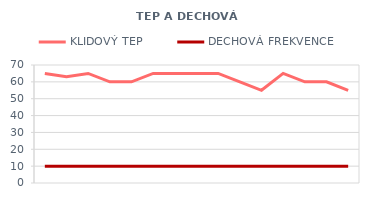
| Category | KLIDOVÝ TEP | DECHOVÁ FREKVENCE |
|---|---|---|
| 6/1/12 | 65 | 10 |
| 6/2/12 | 63 | 10 |
| 6/3/12 | 65 | 10 |
| 6/4/12 | 60 | 10 |
| 6/5/12 | 60 | 10 |
| 6/6/12 | 65 | 10 |
| 6/7/12 | 65 | 10 |
| 6/8/12 | 65 | 10 |
| 6/9/12 | 65 | 10 |
| 6/10/12 | 60 | 10 |
| 6/11/12 | 55 | 10 |
| 6/12/12 | 65 | 10 |
| 6/13/12 | 60 | 10 |
| 6/14/12 | 60 | 10 |
| 6/15/12 | 55 | 10 |